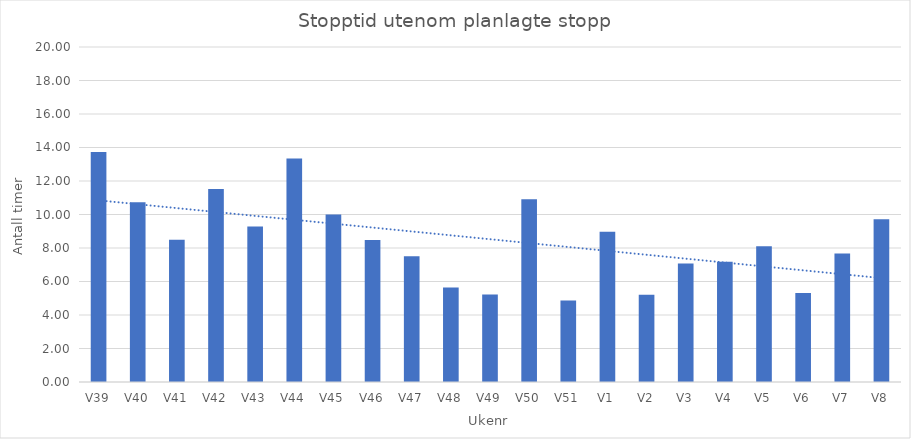
| Category | Stopptid |
|---|---|
| V39 | 13.738 |
| V40 | 10.725 |
| V41 | 8.493 |
| V42 | 11.528 |
| V43 | 9.285 |
| V44 | 13.343 |
| V45 | 10.005 |
| V46 | 8.485 |
| V47 | 7.51 |
| V48 | 5.638 |
| V49 | 5.218 |
| V50 | 10.91 |
| V51 | 4.87 |
| V1 | 8.973 |
| V2 | 5.212 |
| V3 | 7.077 |
| V4 | 7.185 |
| V5 | 8.103 |
| V6 | 5.32 |
| V7 | 7.67 |
| V8 | 9.718 |